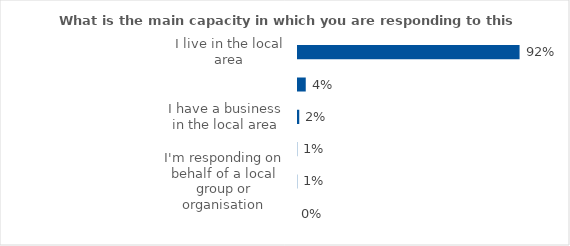
| Category | Series 0 |
|---|---|
| I live in the local area | 0.92 |
| I commute through the local area | 0.044 |
| I have a business in the local area | 0.018 |
| I work/study in the local area | 0.009 |
| I'm responding on behalf of a local group or organisation | 0.009 |
| None of the above / other | 0 |